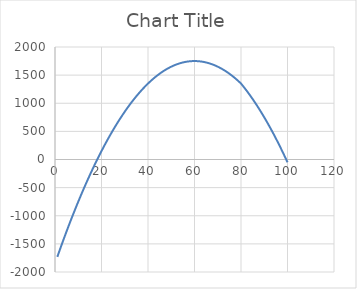
| Category | Series 0 |
|---|---|
| 1.0 | -1731 |
| 2.0 | -1614 |
| 3.0 | -1499 |
| 4.0 | -1386 |
| 5.0 | -1275 |
| 6.0 | -1166 |
| 7.0 | -1059 |
| 8.0 | -954 |
| 9.0 | -851 |
| 10.0 | -750 |
| 11.0 | -651 |
| 12.0 | -554 |
| 13.0 | -459 |
| 14.0 | -366 |
| 15.0 | -275 |
| 16.0 | -186 |
| 17.0 | -99 |
| 18.0 | -14 |
| 19.0 | 69 |
| 20.0 | 150 |
| 21.0 | 229 |
| 22.0 | 306 |
| 23.0 | 381 |
| 24.0 | 454 |
| 25.0 | 525 |
| 26.0 | 594 |
| 27.0 | 661 |
| 28.0 | 726 |
| 29.0 | 789 |
| 30.0 | 850 |
| 31.0 | 909 |
| 32.0 | 966 |
| 33.0 | 1021 |
| 34.0 | 1074 |
| 35.0 | 1125 |
| 36.0 | 1174 |
| 37.0 | 1221 |
| 38.0 | 1266 |
| 39.0 | 1309 |
| 40.0 | 1350 |
| 41.0 | 1389 |
| 42.0 | 1426 |
| 43.0 | 1461 |
| 44.0 | 1494 |
| 45.0 | 1525 |
| 46.0 | 1554 |
| 47.0 | 1581 |
| 48.0 | 1606 |
| 49.0 | 1629 |
| 50.0 | 1650 |
| 51.0 | 1669 |
| 52.0 | 1686 |
| 53.0 | 1701 |
| 54.0 | 1714 |
| 55.0 | 1725 |
| 56.0 | 1734 |
| 57.0 | 1741 |
| 58.0 | 1746 |
| 59.0 | 1749 |
| 60.0 | 1750 |
| 61.0 | 1749 |
| 62.0 | 1746 |
| 63.0 | 1741 |
| 64.0 | 1734 |
| 65.0 | 1725 |
| 66.0 | 1714 |
| 67.0 | 1701 |
| 68.0 | 1686 |
| 69.0 | 1669 |
| 70.0 | 1650 |
| 71.0 | 1629 |
| 72.0 | 1606 |
| 73.0 | 1581 |
| 74.0 | 1554 |
| 75.0 | 1525 |
| 76.0 | 1494 |
| 77.0 | 1461 |
| 78.0 | 1426 |
| 79.0 | 1389 |
| 80.0 | 1350 |
| 81.0 | 1299 |
| 82.0 | 1246 |
| 83.0 | 1191 |
| 84.0 | 1134 |
| 85.0 | 1075 |
| 86.0 | 1014 |
| 87.0 | 951 |
| 88.0 | 886 |
| 89.0 | 819 |
| 90.0 | 750 |
| 91.0 | 679 |
| 92.0 | 606 |
| 93.0 | 531 |
| 94.0 | 454 |
| 95.0 | 375 |
| 96.0 | 294 |
| 97.0 | 211 |
| 98.0 | 126 |
| 99.0 | 39 |
| 100.0 | -50 |